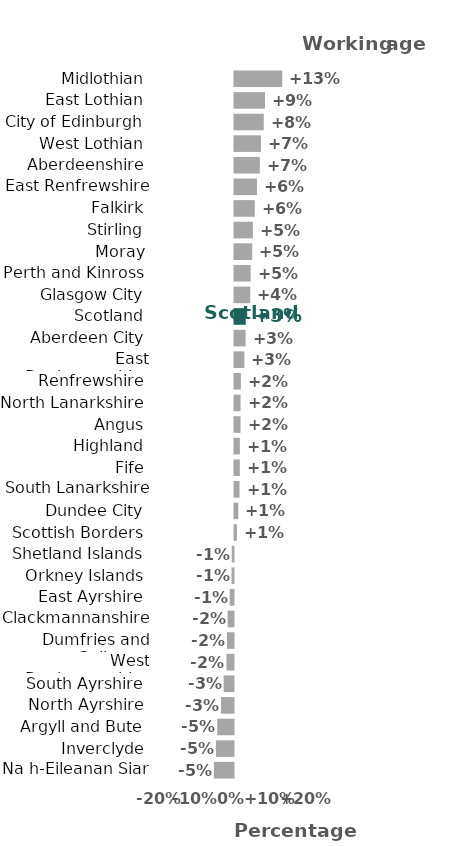
| Category | Series 0 |
|---|---|
| Na h-Eileanan Siar | -5.493 |
| Inverclyde | -4.907 |
| Argyll and Bute | -4.548 |
| North Ayrshire | -3.492 |
| South Ayrshire | -2.772 |
| West Dunbartonshire | -1.97 |
| Dumfries and Galloway | -1.839 |
| Clackmannanshire | -1.636 |
| East Ayrshire | -1.053 |
| Orkney Islands | -0.549 |
| Shetland Islands | -0.502 |
| Scottish Borders | 0.679 |
| Dundee City | 1.057 |
| South Lanarkshire | 1.405 |
| Fife | 1.485 |
| Highland | 1.494 |
| Angus | 1.684 |
| North Lanarkshire | 1.689 |
| Renfrewshire | 1.791 |
| East Dunbartonshire | 2.767 |
| Aberdeen City | 3.103 |
| Scotland | 3.152 |
| Glasgow City | 4.397 |
| Perth and Kinross | 4.523 |
| Moray | 4.963 |
| Stirling | 5.141 |
| Falkirk | 5.669 |
| East Renfrewshire | 6.28 |
| Aberdeenshire | 7.087 |
| West Lothian | 7.389 |
| City of Edinburgh | 8.189 |
| East Lothian | 8.531 |
| Midlothian | 13.36 |